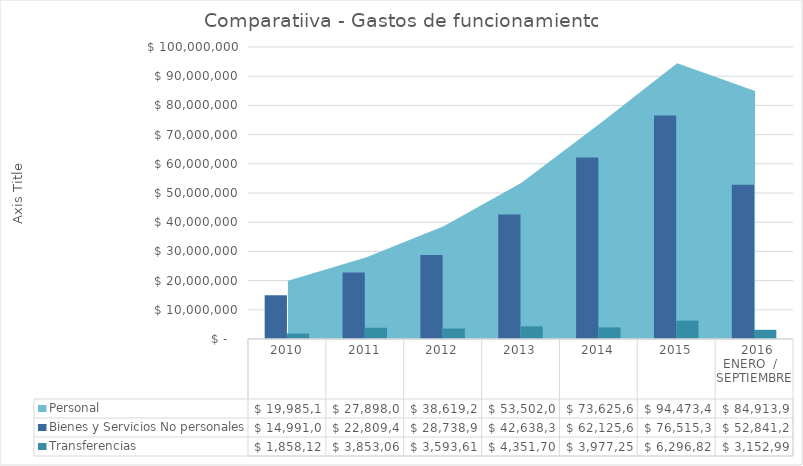
| Category | Bienes y Servicios No personales | Transferencias  |
|---|---|---|
| 2010 | 14991078.27 | 1858120.78 |
| 2011 | 22809496.37 | 3853069.1 |
| 2012 | 28738901.92 | 3593610.81 |
| 2013 | 42638388.92 | 4351705.79 |
| 2014 | 62125659.31 | 3977256.91 |
| 2015 | 76515388.17 | 6296825.31 |
|  2016 ENERO  /   SEPTIEMBRE | 52841201.83 | 3152997.4 |